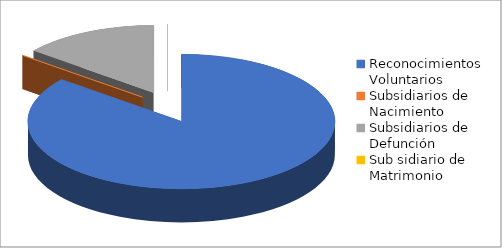
| Category | Series 0 |
|---|---|
| Reconocimientos Voluntarios  | 12 |
| Subsidiarios de Nacimiento | 0 |
| Subsidiarios de Defunción | 2 |
| Sub sidiario de Matrimonio | 0 |